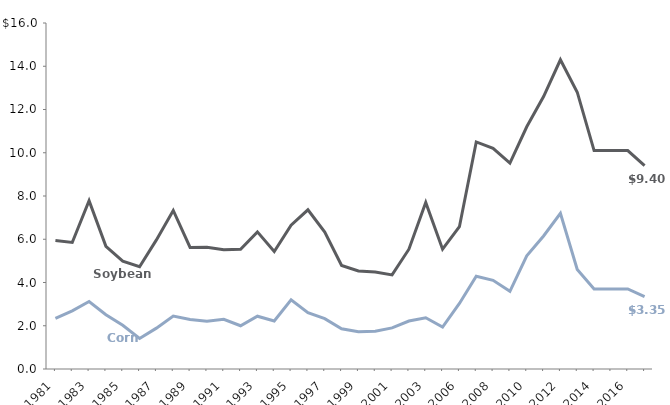
| Category | Corn | Soybeans |
|---|---|---|
| 1981.0 | 2.34 | 5.94 |
| 1982.0 | 2.69 | 5.85 |
| 1983.0 | 3.12 | 7.78 |
| 1984.0 | 2.51 | 5.67 |
| 1985.0 | 2.02 | 4.99 |
| 1986.0 | 1.41 | 4.73 |
| 1987.0 | 1.89 | 5.97 |
| 1988.0 | 2.45 | 7.33 |
| 1989.0 | 2.29 | 5.62 |
| 1990.0 | 2.21 | 5.63 |
| 1991.0 | 2.3 | 5.51 |
| 1992.0 | 2 | 5.54 |
| 1993.0 | 2.44 | 6.34 |
| 1994.0 | 2.22 | 5.43 |
| 1995.0 | 3.2 | 6.65 |
| 1996.0 | 2.6 | 7.36 |
| 1997.0 | 2.33 | 6.33 |
| 1998.0 | 1.86 | 4.79 |
| 1999.0 | 1.72 | 4.53 |
| 2000.0 | 1.75 | 4.49 |
| 2001.0 | 1.9 | 4.35 |
| 2002.0 | 2.22 | 5.54 |
| 2003.0 | 2.37 | 7.7 |
| 2005.0 | 1.94 | 5.54 |
| 2006.0 | 3.03 | 6.58 |
| 2007.0 | 4.29 | 10.5 |
| 2008.0 | 4.1 | 10.2 |
| 2009.0 | 3.59 | 9.52 |
| 2010.0 | 5.23 | 11.2 |
| 2011.0 | 6.15 | 12.6 |
| 2012.0 | 7.2 | 14.3 |
| 2013.0 | 4.6 | 12.8 |
| 2014.0 | 3.7 | 10.1 |
| 2015.0 | 3.7 | 10.1 |
| 2016.0 | 3.7 | 10.1 |
| 2017.0 | 3.35 | 9.4 |